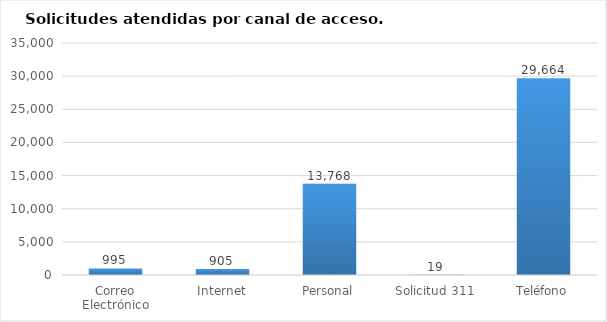
| Category | Total |
|---|---|
| Correo Electrónico | 995 |
| Internet | 905 |
| Personal | 13768 |
| Solicitud 311 | 19 |
| Teléfono | 29664 |